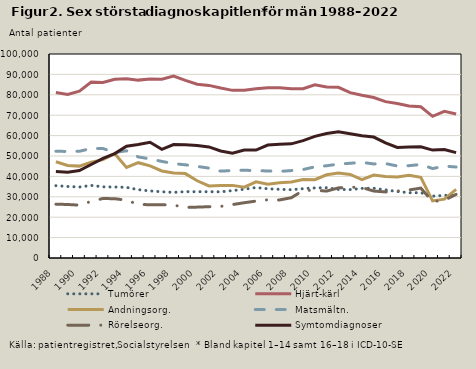
| Category | Tumörer | Hjärt-kärl | Andningsorg.  | Matsmältn. | Rörelseorg.  | Symtomdiagnoser |
|---|---|---|---|---|---|---|
| 1988.0 | 35460 | 81109 | 47169 | 52332 | 26399 | 42345 |
| 1989.0 | 35062 | 80135 | 45323 | 52228 | 26226 | 42084 |
| 1990.0 | 34793 | 81811 | 45038 | 52308 | 25908 | 42897 |
| 1991.0 | 35583 | 86215 | 47018 | 53686 | 27750 | 45816 |
| 1992.0 | 34879 | 86015 | 48190 | 53663 | 29176 | 48785 |
| 1993.0 | 34796 | 87578 | 51150 | 51714 | 29047 | 51206 |
| 1994.0 | 34623 | 87813 | 44413 | 52561 | 28350 | 54810 |
| 1995.0 | 33485 | 87197 | 46715 | 49527 | 26238 | 55637 |
| 1996.0 | 32872 | 87700 | 45170 | 48581 | 26123 | 56745 |
| 1997.0 | 32473 | 87650 | 42649 | 47345 | 26124 | 53238 |
| 1998.0 | 32154 | 89183 | 41662 | 46265 | 25902 | 55639 |
| 1999.0 | 32537 | 87079 | 41373 | 45678 | 24792 | 55562 |
| 2000.0 | 32481 | 85150 | 37861 | 44895 | 24943 | 55193 |
| 2001.0 | 32498 | 84605 | 35345 | 44068 | 25152 | 54442 |
| 2002.0 | 32444 | 83306 | 35555 | 42577 | 25290 | 52472 |
| 2003.0 | 33029 | 82181 | 35595 | 42885 | 26183 | 51323 |
| 2004.0 | 33736 | 82270 | 34710 | 43043 | 27094 | 52893 |
| 2005.0 | 34541 | 82941 | 37308 | 42792 | 27892 | 52883 |
| 2006.0 | 33935 | 83512 | 36161 | 42677 | 28532 | 55359 |
| 2007.0 | 33664 | 83470 | 36876 | 42451 | 28455 | 55799 |
| 2008.0 | 33465 | 82982 | 37241 | 42846 | 29543 | 55960 |
| 2009.0 | 33978 | 83023 | 38512 | 43366 | 33051 | 57558 |
| 2010.0 | 34358 | 84946 | 38384 | 44691 | 33263 | 59611 |
| 2011.0 | 34447 | 83819 | 40775 | 45222 | 32788 | 61048 |
| 2012.0 | 33610 | 83672 | 41616 | 46035 | 34367 | 61827 |
| 2013.0 | 33530 | 81071 | 40941 | 46444 | 34732 | 60880 |
| 2014.0 | 34137 | 79800 | 38387 | 46867 | 34549 | 59930 |
| 2015.0 | 34190 | 78671 | 40637 | 46118 | 32817 | 59286 |
| 2016.0 | 33390 | 76642 | 39943 | 46304 | 32388 | 56435 |
| 2017.0 | 32592 | 75746 | 39665 | 45111 | 32828 | 54172 |
| 2018.0 | 31998 | 74533 | 40561 | 45269 | 33342 | 54375 |
| 2019.0 | 31995 | 74112 | 39570 | 45836 | 34249 | 54545 |
| 2020.0 | 30343 | 69443 | 28001 | 43852 | 27684 | 52901 |
| 2021.0 | 30687 | 71915 | 28851 | 45007 | 28279 | 53170 |
| 2022.0 | 30967 | 70621 | 33608 | 44616 | 31178 | 51667 |